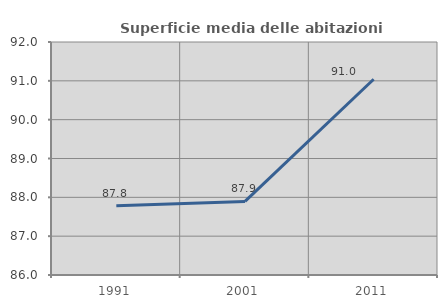
| Category | Superficie media delle abitazioni occupate |
|---|---|
| 1991.0 | 87.781 |
| 2001.0 | 87.894 |
| 2011.0 | 91.04 |